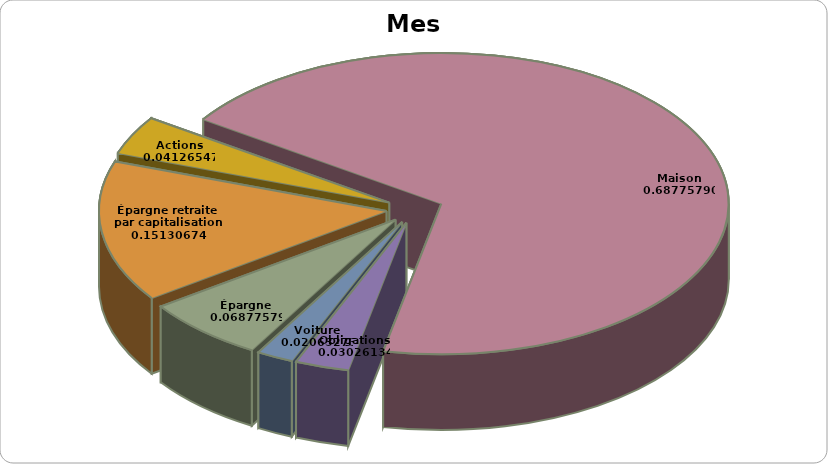
| Category | Montant |
|---|---|
| Épargne | 25000 |
| Épargne retraite par capitalisation | 55000 |
| Actions | 15000 |
| Maison | 250000 |
| Obligations | 11000 |
| Voiture | 7500 |